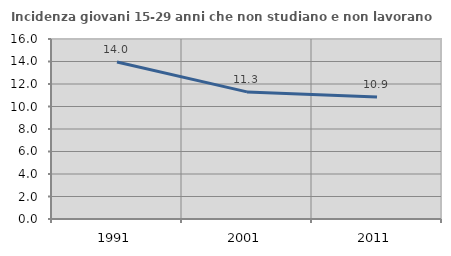
| Category | Incidenza giovani 15-29 anni che non studiano e non lavorano  |
|---|---|
| 1991.0 | 13.953 |
| 2001.0 | 11.299 |
| 2011.0 | 10.853 |